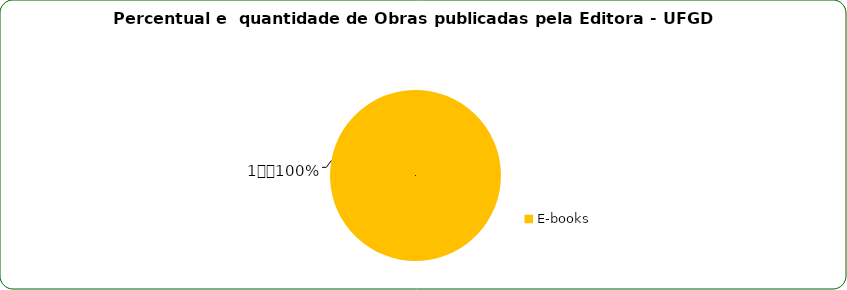
| Category | Series 0 |
|---|---|
| E-books | 1 |